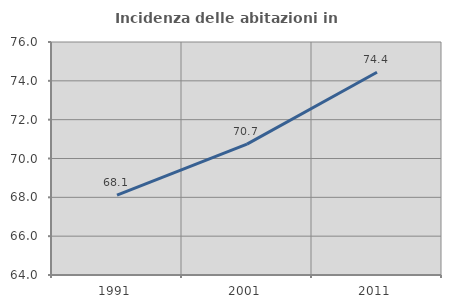
| Category | Incidenza delle abitazioni in proprietà  |
|---|---|
| 1991.0 | 68.11 |
| 2001.0 | 70.739 |
| 2011.0 | 74.44 |